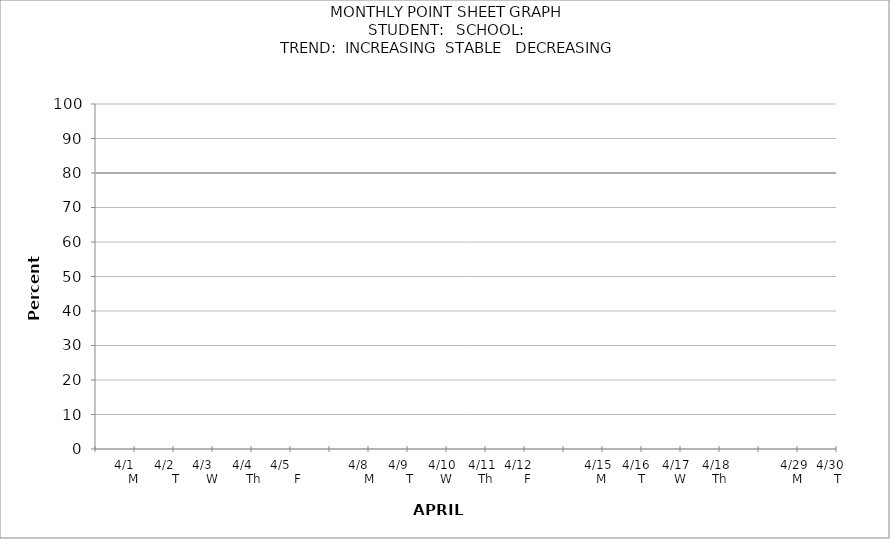
| Category | PERCENTAGE | target |
|---|---|---|
|  |  | 80 |
| 4/1      M |  | 80 |
| 4/2       T |  | 80 |
| 4/3      W |  | 80 |
| 4/4       Th |  | 80 |
| 4/5          F |  | 80 |
|  |  | 80 |
| 4/8       M |  | 80 |
| 4/9       T |  | 80 |
| 4/10   W |  | 80 |
| 4/11   Th |  | 80 |
| 4/12      F |  | 80 |
|  |  | 80 |
| 4/15   M |  | 80 |
| 4/16    T |  | 80 |
| 4/17   W |  | 80 |
| 4/18   Th |  | 80 |
|  |  | 80 |
| 4/29   M |  | 80 |
| 4/30     T |  | 80 |